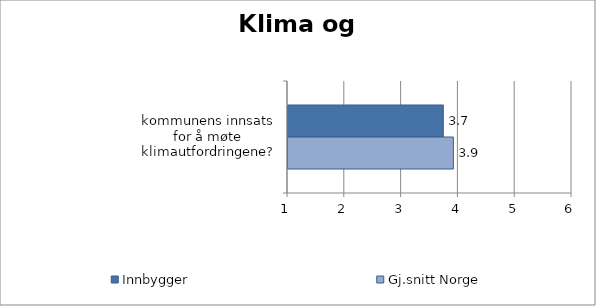
| Category | Innbygger | Gj.snitt Norge |
|---|---|---|
| kommunens innsats for å møte klimautfordringene? | 3.734 | 3.911 |